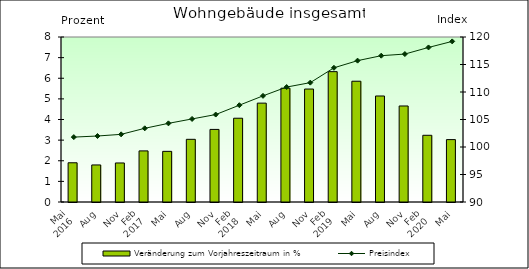
| Category | Veränderung zum Vorjahreszeitraum in % |
|---|---|
| 0 | 1.902 |
| 1 | 1.796 |
| 2 | 1.892 |
| 3 | 2.478 |
| 4 | 2.456 |
| 5 | 3.039 |
| 6 | 3.519 |
| 7 | 4.062 |
| 8 | 4.794 |
| 9 | 5.519 |
| 10 | 5.477 |
| 11 | 6.32 |
| 12 | 5.855 |
| 13 | 5.14 |
| 14 | 4.655 |
| 15 | 3.234 |
| 16 | 3.025 |